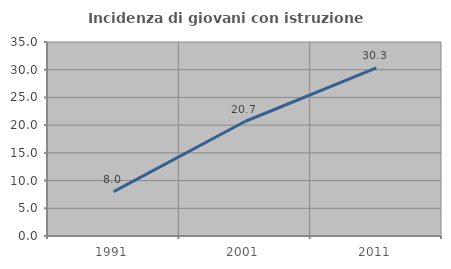
| Category | Incidenza di giovani con istruzione universitaria |
|---|---|
| 1991.0 | 8.017 |
| 2001.0 | 20.656 |
| 2011.0 | 30.315 |